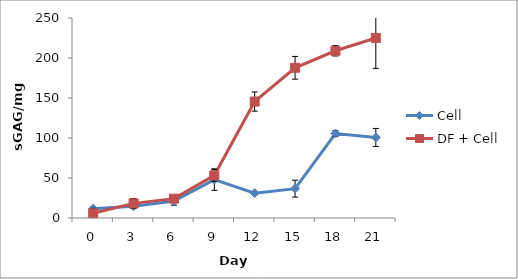
| Category | Cell | DF + Cell |
|---|---|---|
| 0.0 | 11.583 | 5.862 |
| 3.0 | 14.585 | 18.284 |
| 6.0 | 21.08 | 24.177 |
| 9.0 | 48.01 | 53.34 |
| 12.0 | 31.095 | 145.572 |
| 15.0 | 36.684 | 187.772 |
| 18.0 | 105.58 | 209.048 |
| 21.0 | 100.663 | 225.066 |